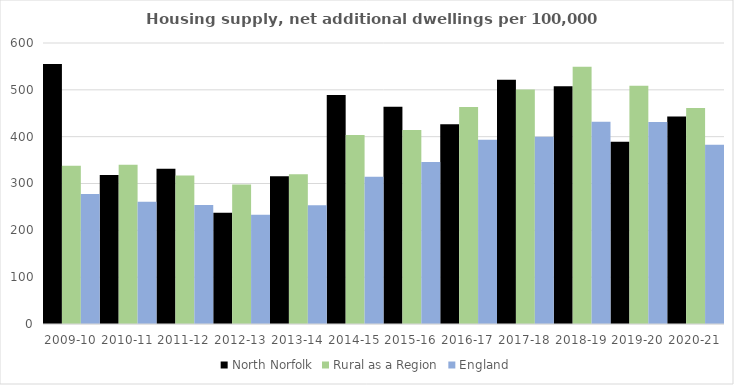
| Category | North Norfolk | Rural as a Region | England |
|---|---|---|---|
| 2009-10 | 555.412 | 337.852 | 277.548 |
| 2010-11 | 318.019 | 340.105 | 260.994 |
| 2011-12 | 331.484 | 317.04 | 254.007 |
| 2012-13 | 237.653 | 297.763 | 233.153 |
| 2013-14 | 315.442 | 319.835 | 253.602 |
| 2014-15 | 488.957 | 403.796 | 314.256 |
| 2015-16 | 463.914 | 414.091 | 346.154 |
| 2016-17 | 426.694 | 463.209 | 393.256 |
| 2017-18 | 521.779 | 500.68 | 399.646 |
| 2018-19 | 507.881 | 549.491 | 432.099 |
| 2019-20 | 389.176 | 508.493 | 431.187 |
| 2020-21 | 443.105 | 461.114 | 382.827 |